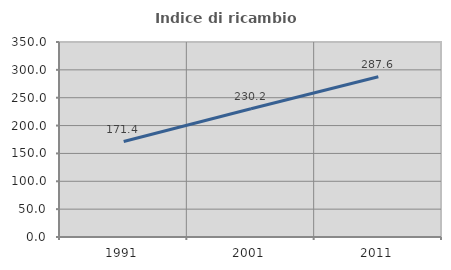
| Category | Indice di ricambio occupazionale  |
|---|---|
| 1991.0 | 171.374 |
| 2001.0 | 230.18 |
| 2011.0 | 287.603 |